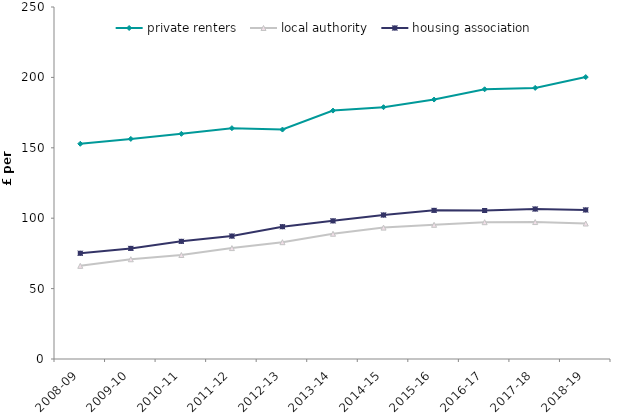
| Category | private renters | local authority | housing association |
|---|---|---|---|
| 2008-09 | 152.863 | 66.161 | 75.101 |
| 2009-10 | 156.307 | 70.835 | 78.56 |
| 2010-11 | 159.915 | 73.854 | 83.56 |
| 2011-12 | 163.945 | 78.776 | 87.311 |
| 2012-13 | 162.962 | 82.954 | 93.96 |
| 2013-14 | 176.433 | 88.956 | 98.11 |
| 2014-15 | 178.832 | 93.313 | 102.263 |
| 2015-16 | 184.267 | 95.301 | 105.562 |
| 2016-17 | 191.551 | 97.163 | 105.45 |
| 2017-18 | 192.544 | 97.266 | 106.525 |
| 2018-19 | 200.233 | 96.222 | 105.872 |